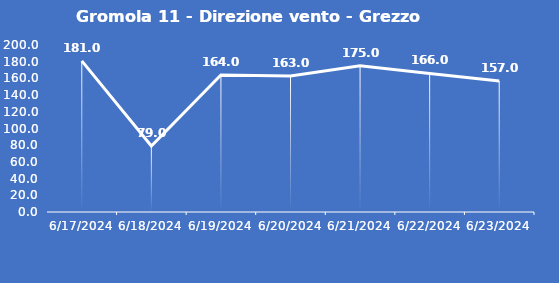
| Category | Gromola 11 - Direzione vento - Grezzo (°N) |
|---|---|
| 6/17/24 | 181 |
| 6/18/24 | 79 |
| 6/19/24 | 164 |
| 6/20/24 | 163 |
| 6/21/24 | 175 |
| 6/22/24 | 166 |
| 6/23/24 | 157 |